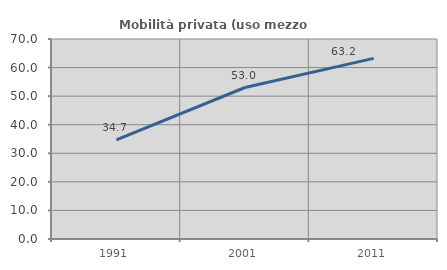
| Category | Mobilità privata (uso mezzo privato) |
|---|---|
| 1991.0 | 34.675 |
| 2001.0 | 53.023 |
| 2011.0 | 63.223 |